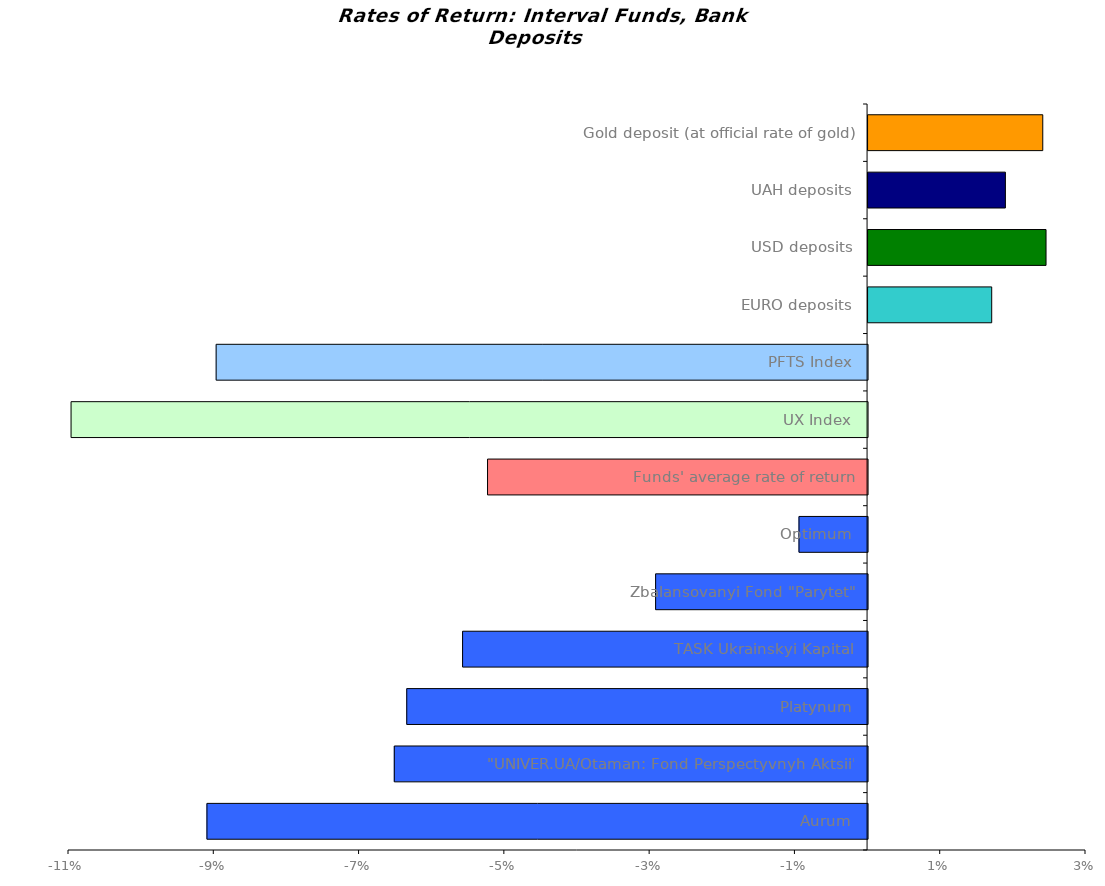
| Category | Series 0 |
|---|---|
| Aurum | -0.091 |
| "UNIVER.UA/Otaman: Fond Perspectyvnyh Aktsii" | -0.065 |
| Platynum | -0.063 |
| TASK Ukrainskyi Kapital | -0.056 |
| Zbalansovanyi Fond "Parytet" | -0.029 |
| Optimum | -0.009 |
| Funds' average rate of return | -0.052 |
| UX Index | -0.11 |
| PFTS Index | -0.09 |
| EURO deposits | 0.017 |
| USD deposits | 0.024 |
| UAH deposits | 0.019 |
| Gold deposit (at official rate of gold) | 0.024 |